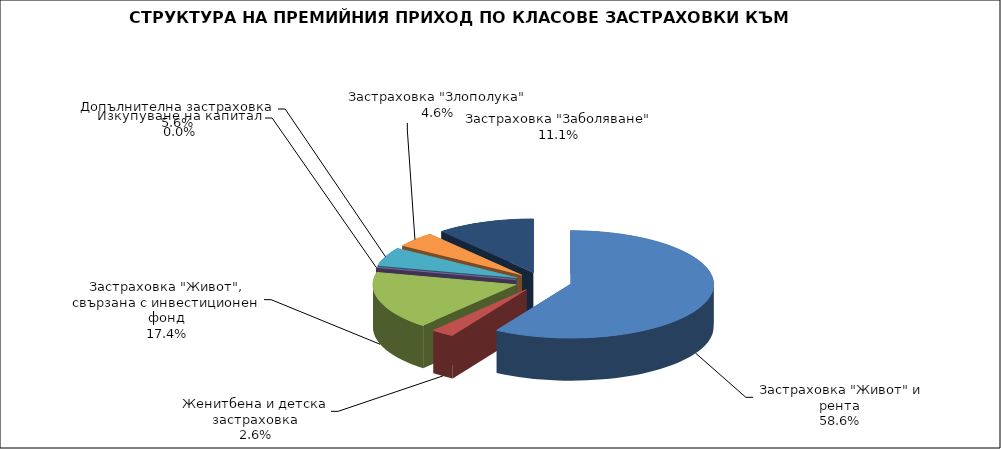
| Category |  Застраховка "Живот" и рента |
|---|---|
|  Застраховка "Живот" и рента | 70771268.351 |
| Женитбена и детска застраховка | 3185701.452 |
| Застраховка "Живот", свързана с инвестиционен фонд | 21019224.134 |
| Изкупуване на капитал | 0 |
| Допълнителна застраховка | 6743137.618 |
| Застраховка "Злополука" | 5595626.516 |
| Застраховка "Заболяване" | 13416488.503 |